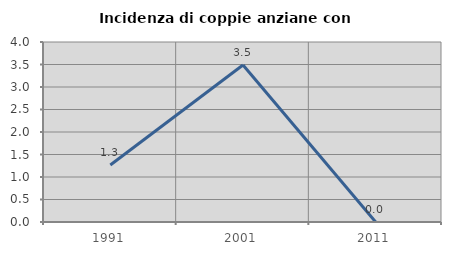
| Category | Incidenza di coppie anziane con figli |
|---|---|
| 1991.0 | 1.266 |
| 2001.0 | 3.488 |
| 2011.0 | 0 |